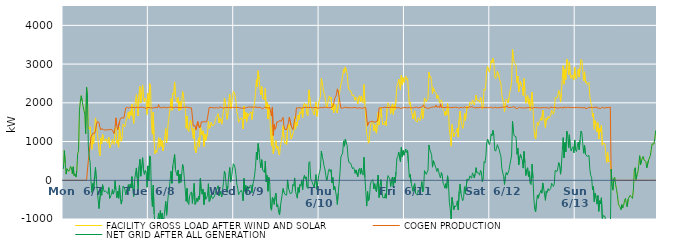
| Category | FACILITY GROSS LOAD AFTER WIND AND SOLAR | COGEN PRODUCTION | NET GRID AFTER ALL GENERATION |
|---|---|---|---|
|  Mon  6/7 | 294 | 0 | 294 |
|  Mon  6/7 | 766 | 0 | 766 |
|  Mon  6/7 | 447 | 0 | 447 |
|  Mon  6/7 | 160 | 0 | 160 |
|  Mon  6/7 | 298 | 0 | 298 |
|  Mon  6/7 | 299 | 0 | 299 |
|  Mon  6/7 | 231 | 0 | 231 |
|  Mon  6/7 | 272 | 0 | 272 |
|  Mon  6/7 | 359 | 0 | 359 |
|  Mon  6/7 | 328 | 0 | 328 |
|  Mon  6/7 | 166 | 0 | 166 |
|  Mon  6/7 | 348 | 0 | 348 |
|  Mon  6/7 | 120 | 0 | 120 |
|  Mon  6/7 | 164 | 0 | 164 |
|  Mon  6/7 | 82 | 0 | 82 |
|  Mon  6/7 | 239 | 0 | 239 |
|  Mon  6/7 | 687 | 0 | 687 |
|  Mon  6/7 | 764 | 0 | 764 |
|  Mon  6/7 | 1805 | 0 | 1805 |
|  Mon  6/7 | 2027 | 0 | 2027 |
|  Mon  6/7 | 2183 | 0 | 2183 |
|  Mon  6/7 | 2055 | 0 | 2055 |
|  Mon  6/7 | 1924 | 0 | 1924 |
|  Mon  6/7 | 1907 | 0 | 1907 |
|  Mon  6/7 | 1708 | 0 | 1708 |
|  Mon  6/7 | 1203 | 0 | 1203 |
|  Mon  6/7 | 2402 | 0 | 2402 |
|  Mon  6/7 | 2151 | 0 | 2151 |
|  Mon  6/7 | 1401 | 518 | 883 |
|  Mon  6/7 | 1317 | 716 | 601 |
|  Mon  6/7 | 1381 | 915 | 466 |
|  Mon  6/7 | 1094 | 1120 | -26 |
|  Mon  6/7 | 798 | 1112 | -314 |
|  Mon  6/7 | 1129 | 1211 | -82 |
|  Mon  6/7 | 947 | 1205 | -258 |
|  Mon  6/7 | 1332 | 1212 | 120 |
|  Mon  6/7 | 1610 | 1278 | 332 |
|  Mon  6/7 | 1437 | 1422 | 15 |
|  Mon  6/7 | 1253 | 1520 | -267 |
|  Mon  6/7 | 1029 | 1522 | -493 |
|  Mon  6/7 | 758 | 1489 | -731 |
|  Mon  6/7 | 634 | 1370 | -736 |
|  Mon  6/7 | 1093 | 1302 | -209 |
|  Mon  6/7 | 947 | 1333 | -386 |
|  Mon  6/7 | 1193 | 1308 | -115 |
|  Mon  6/7 | 1079 | 1307 | -228 |
|  Mon  6/7 | 1008 | 1308 | -300 |
|  Mon  6/7 | 1024 | 1297 | -273 |
|  Mon  6/7 | 1071 | 1319 | -248 |
|  Mon  6/7 | 987 | 1303 | -316 |
|  Mon  6/7 | 957 | 1306 | -349 |
|  Mon  6/7 | 1116 | 1305 | -189 |
|  Mon  6/7 | 834 | 1299 | -465 |
|  Mon  6/7 | 903 | 1315 | -412 |
|  Mon  6/7 | 941 | 1307 | -366 |
|  Mon  6/7 | 1055 | 1296 | -241 |
|  Mon  6/7 | 954 | 1312 | -358 |
|  Mon  6/7 | 923 | 1207 | -284 |
|  Mon  6/7 | 1339 | 1353 | -14 |
|  Mon  6/7 | 1368 | 1612 | -244 |
|  Mon  6/7 | 953 | 1406 | -453 |
|  Mon  6/7 | 1029 | 1306 | -277 |
|  Mon  6/7 | 852 | 1316 | -464 |
|  Mon  6/7 | 1372 | 1504 | -132 |
|  Mon  6/7 | 1122 | 1598 | -476 |
|  Mon  6/7 | 1005 | 1620 | -615 |
|  Mon  6/7 | 1114 | 1611 | -497 |
|  Mon  6/7 | 1454 | 1603 | -149 |
|  Mon  6/7 | 1455 | 1607 | -152 |
|  Mon  6/7 | 1375 | 1600 | -225 |
|  Mon  6/7 | 1499 | 1869 | -370 |
|  Mon  6/7 | 1483 | 1871 | -388 |
|  Mon  6/7 | 1671 | 1882 | -211 |
|  Mon  6/7 | 1759 | 1872 | -113 |
|  Mon  6/7 | 1585 | 1861 | -276 |
|  Mon  6/7 | 1781 | 1888 | -107 |
|  Mon  6/7 | 1676 | 1874 | -198 |
|  Mon  6/7 | 1971 | 1877 | 94 |
|  Mon  6/7 | 1664 | 1863 | -199 |
|  Mon  6/7 | 1465 | 1882 | -417 |
|  Mon  6/7 | 1882 | 1879 | 3 |
|  Mon  6/7 | 1863 | 1873 | -10 |
|  Mon  6/7 | 2212 | 1894 | 318 |
|  Mon  6/7 | 1939 | 1890 | 49 |
|  Mon  6/7 | 1662 | 1883 | -221 |
|  Mon  6/7 | 2215 | 1869 | 346 |
|  Mon  6/7 | 2424 | 1880 | 544 |
|  Mon  6/7 | 1997 | 1893 | 104 |
|  Mon  6/7 | 2252 | 1876 | 376 |
|  Mon  6/7 | 2462 | 1880 | 582 |
|  Mon  6/7 | 2119 | 1872 | 247 |
|  Mon  6/7 | 2029 | 1876 | 153 |
|  Mon  6/7 | 2123 | 1871 | 252 |
|  Mon  6/7 | 2066 | 1851 | 215 |
|  Mon  6/7 | 1699 | 1879 | -180 |
|  Mon  6/7 | 2253 | 1882 | 371 |
|  Tue  6/8 | 1859 | 1876 | -17 |
|  Tue  6/8 | 2493 | 1865 | 628 |
|  Tue  6/8 | 2418 | 1873 | 545 |
|  Tue  6/8 | 1460 | 1877 | -417 |
|  Tue  6/8 | 1191 | 1867 | -676 |
|  Tue  6/8 | 1759 | 1883 | -124 |
|  Tue  6/8 | 1002 | 1876 | -874 |
|  Tue  6/8 | 682 | 1872 | -1190 |
|  Tue  6/8 | 777 | 1886 | -1109 |
|  Tue  6/8 | 716 | 1873 | -1157 |
|  Tue  6/8 | 853 | 1871 | -1018 |
|  Tue  6/8 | 1102 | 1954 | -852 |
|  Tue  6/8 | 831 | 1882 | -1051 |
|  Tue  6/8 | 1083 | 1866 | -783 |
|  Tue  6/8 | 876 | 1870 | -994 |
|  Tue  6/8 | 1026 | 1878 | -852 |
|  Tue  6/8 | 756 | 1876 | -1120 |
|  Tue  6/8 | 900 | 1873 | -973 |
|  Tue  6/8 | 1124 | 1890 | -766 |
|  Tue  6/8 | 1333 | 1879 | -546 |
|  Tue  6/8 | 965 | 1868 | -903 |
|  Tue  6/8 | 1260 | 1873 | -613 |
|  Tue  6/8 | 1519 | 1881 | -362 |
|  Tue  6/8 | 1664 | 1881 | -217 |
|  Tue  6/8 | 1685 | 1891 | -206 |
|  Tue  6/8 | 2109 | 1872 | 237 |
|  Tue  6/8 | 1807 | 1885 | -78 |
|  Tue  6/8 | 2255 | 1880 | 375 |
|  Tue  6/8 | 2225 | 1871 | 354 |
|  Tue  6/8 | 2538 | 1871 | 667 |
|  Tue  6/8 | 2161 | 1889 | 272 |
|  Tue  6/8 | 2056 | 1870 | 186 |
|  Tue  6/8 | 1999 | 1882 | 117 |
|  Tue  6/8 | 2142 | 1876 | 266 |
|  Tue  6/8 | 1797 | 1873 | -76 |
|  Tue  6/8 | 2039 | 1882 | 157 |
|  Tue  6/8 | 1823 | 1875 | -52 |
|  Tue  6/8 | 2033 | 1871 | 162 |
|  Tue  6/8 | 2289 | 1881 | 408 |
|  Tue  6/8 | 2180 | 1879 | 301 |
|  Tue  6/8 | 1920 | 1882 | 38 |
|  Tue  6/8 | 1890 | 1873 | 17 |
|  Tue  6/8 | 1344 | 1888 | -544 |
|  Tue  6/8 | 1662 | 1871 | -209 |
|  Tue  6/8 | 1304 | 1880 | -576 |
|  Tue  6/8 | 1254 | 1880 | -626 |
|  Tue  6/8 | 1483 | 1871 | -388 |
|  Tue  6/8 | 1549 | 1887 | -338 |
|  Tue  6/8 | 1572 | 1871 | -299 |
|  Tue  6/8 | 1268 | 1866 | -598 |
|  Tue  6/8 | 1082 | 1402 | -320 |
|  Tue  6/8 | 1336 | 1416 | -80 |
|  Tue  6/8 | 786 | 1410 | -624 |
|  Tue  6/8 | 710 | 1302 | -592 |
|  Tue  6/8 | 854 | 1313 | -459 |
|  Tue  6/8 | 969 | 1516 | -547 |
|  Tue  6/8 | 1095 | 1508 | -413 |
|  Tue  6/8 | 858 | 1350 | -492 |
|  Tue  6/8 | 1430 | 1378 | 52 |
|  Tue  6/8 | 1222 | 1506 | -284 |
|  Tue  6/8 | 1164 | 1522 | -358 |
|  Tue  6/8 | 1278 | 1509 | -231 |
|  Tue  6/8 | 876 | 1504 | -628 |
|  Tue  6/8 | 1197 | 1510 | -313 |
|  Tue  6/8 | 1029 | 1520 | -491 |
|  Tue  6/8 | 1048 | 1508 | -460 |
|  Tue  6/8 | 1219 | 1608 | -389 |
|  Tue  6/8 | 1529 | 1617 | -88 |
|  Tue  6/8 | 1333 | 1884 | -551 |
|  Tue  6/8 | 1362 | 1878 | -516 |
|  Tue  6/8 | 1500 | 1874 | -374 |
|  Tue  6/8 | 1428 | 1869 | -441 |
|  Tue  6/8 | 1400 | 1876 | -476 |
|  Tue  6/8 | 1416 | 1882 | -466 |
|  Tue  6/8 | 1461 | 1866 | -405 |
|  Tue  6/8 | 1586 | 1887 | -301 |
|  Tue  6/8 | 1586 | 1881 | -295 |
|  Tue  6/8 | 1665 | 1870 | -205 |
|  Tue  6/8 | 1721 | 1863 | -142 |
|  Tue  6/8 | 1481 | 1880 | -399 |
|  Tue  6/8 | 1611 | 1891 | -280 |
|  Tue  6/8 | 1529 | 1879 | -350 |
|  Tue  6/8 | 1447 | 1875 | -428 |
|  Tue  6/8 | 1638 | 1880 | -242 |
|  Tue  6/8 | 1814 | 1865 | -51 |
|  Tue  6/8 | 2114 | 1875 | 239 |
|  Tue  6/8 | 2027 | 1879 | 148 |
|  Tue  6/8 | 1749 | 1875 | -126 |
|  Tue  6/8 | 1574 | 1886 | -312 |
|  Tue  6/8 | 1728 | 1874 | -146 |
|  Tue  6/8 | 2031 | 1878 | 153 |
|  Tue  6/8 | 2225 | 1896 | 329 |
|  Tue  6/8 | 1841 | 1875 | -34 |
|  Tue  6/8 | 1931 | 1879 | 52 |
|  Tue  6/8 | 2133 | 1887 | 246 |
|  Tue  6/8 | 2301 | 1874 | 427 |
|  Wed  6/9 | 2272 | 1876 | 396 |
|  Wed  6/9 | 2194 | 1877 | 317 |
|  Wed  6/9 | 2032 | 1882 | 150 |
|  Wed  6/9 | 1775 | 1875 | -100 |
|  Wed  6/9 | 1676 | 1882 | -206 |
|  Wed  6/9 | 1496 | 1870 | -374 |
|  Wed  6/9 | 1550 | 1869 | -319 |
|  Wed  6/9 | 1553 | 1870 | -317 |
|  Wed  6/9 | 1612 | 1867 | -255 |
|  Wed  6/9 | 1563 | 1880 | -317 |
|  Wed  6/9 | 1330 | 1859 | -529 |
|  Wed  6/9 | 1915 | 1866 | 49 |
|  Wed  6/9 | 1583 | 1866 | -283 |
|  Wed  6/9 | 1761 | 1888 | -127 |
|  Wed  6/9 | 1501 | 1875 | -374 |
|  Wed  6/9 | 1724 | 1875 | -151 |
|  Wed  6/9 | 1656 | 1892 | -236 |
|  Wed  6/9 | 1714 | 1870 | -156 |
|  Wed  6/9 | 1728 | 1892 | -164 |
|  Wed  6/9 | 1768 | 1892 | -124 |
|  Wed  6/9 | 1567 | 1886 | -319 |
|  Wed  6/9 | 1773 | 1873 | -100 |
|  Wed  6/9 | 1876 | 1884 | -8 |
|  Wed  6/9 | 2027 | 1888 | 139 |
|  Wed  6/9 | 2250 | 1891 | 359 |
|  Wed  6/9 | 2601 | 1873 | 728 |
|  Wed  6/9 | 2413 | 1880 | 533 |
|  Wed  6/9 | 2828 | 1879 | 949 |
|  Wed  6/9 | 2616 | 1883 | 733 |
|  Wed  6/9 | 2383 | 1886 | 497 |
|  Wed  6/9 | 2201 | 1875 | 326 |
|  Wed  6/9 | 2421 | 1890 | 531 |
|  Wed  6/9 | 2112 | 1845 | 267 |
|  Wed  6/9 | 2134 | 1869 | 265 |
|  Wed  6/9 | 2085 | 1884 | 201 |
|  Wed  6/9 | 2370 | 1874 | 496 |
|  Wed  6/9 | 1840 | 1881 | -41 |
|  Wed  6/9 | 2015 | 1890 | 125 |
|  Wed  6/9 | 1581 | 1864 | -283 |
|  Wed  6/9 | 1948 | 1875 | 73 |
|  Wed  6/9 | 1796 | 1877 | -81 |
|  Wed  6/9 | 1158 | 1875 | -717 |
|  Wed  6/9 | 883 | 1657 | -774 |
|  Wed  6/9 | 1441 | 1885 | -444 |
|  Wed  6/9 | 685 | 1159 | -474 |
|  Wed  6/9 | 814 | 1437 | -623 |
|  Wed  6/9 | 895 | 1318 | -423 |
|  Wed  6/9 | 1025 | 1358 | -333 |
|  Wed  6/9 | 823 | 1506 | -683 |
|  Wed  6/9 | 882 | 1513 | -631 |
|  Wed  6/9 | 691 | 1508 | -817 |
|  Wed  6/9 | 648 | 1544 | -896 |
|  Wed  6/9 | 879 | 1547 | -668 |
|  Wed  6/9 | 863 | 1525 | -662 |
|  Wed  6/9 | 1138 | 1500 | -362 |
|  Wed  6/9 | 1412 | 1625 | -213 |
|  Wed  6/9 | 1094 | 1405 | -311 |
|  Wed  6/9 | 947 | 1309 | -362 |
|  Wed  6/9 | 984 | 1326 | -342 |
|  Wed  6/9 | 924 | 1310 | -386 |
|  Wed  6/9 | 1305 | 1295 | 10 |
|  Wed  6/9 | 1287 | 1487 | -200 |
|  Wed  6/9 | 1450 | 1627 | -177 |
|  Wed  6/9 | 1263 | 1608 | -345 |
|  Wed  6/9 | 1064 | 1413 | -349 |
|  Wed  6/9 | 1089 | 1412 | -323 |
|  Wed  6/9 | 1204 | 1310 | -106 |
|  Wed  6/9 | 1272 | 1423 | -151 |
|  Wed  6/9 | 1641 | 1580 | 61 |
|  Wed  6/9 | 1321 | 1611 | -290 |
|  Wed  6/9 | 1499 | 1871 | -372 |
|  Wed  6/9 | 1412 | 1873 | -461 |
|  Wed  6/9 | 1683 | 1868 | -185 |
|  Wed  6/9 | 1568 | 1881 | -313 |
|  Wed  6/9 | 1766 | 1875 | -109 |
|  Wed  6/9 | 1727 | 1876 | -149 |
|  Wed  6/9 | 1869 | 1859 | 10 |
|  Wed  6/9 | 1619 | 1863 | -244 |
|  Wed  6/9 | 1936 | 1884 | 52 |
|  Wed  6/9 | 1991 | 1862 | 129 |
|  Wed  6/9 | 1911 | 1879 | 32 |
|  Wed  6/9 | 1963 | 1875 | 88 |
|  Wed  6/9 | 1706 | 1882 | -176 |
|  Wed  6/9 | 1666 | 1880 | -214 |
|  Wed  6/9 | 2334 | 1878 | 456 |
|  Wed  6/9 | 2336 | 1854 | 482 |
|  Wed  6/9 | 1923 | 1886 | 37 |
|  Wed  6/9 | 1874 | 1877 | -3 |
|  Wed  6/9 | 1802 | 1872 | -70 |
|  Wed  6/9 | 1800 | 1878 | -78 |
|  Wed  6/9 | 1689 | 1876 | -187 |
|  Wed  6/9 | 1869 | 1889 | -20 |
|  Wed  6/9 | 2025 | 1880 | 145 |
|  Wed  6/9 | 1649 | 1884 | -235 |
|  Wed  6/9 | 1790 | 1861 | -71 |
|  Wed  6/9 | 2000 | 1879 | 121 |
|  Thu  6/10 | 2080 | 1872 | 208 |
|  Thu  6/10 | 2164 | 1860 | 304 |
|  Thu  6/10 | 2632 | 1881 | 751 |
|  Thu  6/10 | 2490 | 1873 | 617 |
|  Thu  6/10 | 2397 | 1872 | 525 |
|  Thu  6/10 | 2245 | 1869 | 376 |
|  Thu  6/10 | 2179 | 1887 | 292 |
|  Thu  6/10 | 2012 | 1883 | 129 |
|  Thu  6/10 | 1877 | 1882 | -5 |
|  Thu  6/10 | 1963 | 1878 | 85 |
|  Thu  6/10 | 2106 | 1874 | 232 |
|  Thu  6/10 | 2181 | 1887 | 294 |
|  Thu  6/10 | 2097 | 1875 | 222 |
|  Thu  6/10 | 2150 | 1878 | 272 |
|  Thu  6/10 | 1819 | 1884 | -65 |
|  Thu  6/10 | 1986 | 1916 | 70 |
|  Thu  6/10 | 1747 | 1986 | -239 |
|  Thu  6/10 | 1961 | 2119 | -158 |
|  Thu  6/10 | 1869 | 2150 | -281 |
|  Thu  6/10 | 1792 | 2205 | -413 |
|  Thu  6/10 | 1736 | 2360 | -624 |
|  Thu  6/10 | 1957 | 2288 | -331 |
|  Thu  6/10 | 2189 | 2272 | -83 |
|  Thu  6/10 | 2206 | 2003 | 203 |
|  Thu  6/10 | 2472 | 1869 | 603 |
|  Thu  6/10 | 2542 | 1887 | 655 |
|  Thu  6/10 | 2565 | 1861 | 704 |
|  Thu  6/10 | 2868 | 1852 | 1016 |
|  Thu  6/10 | 2769 | 1889 | 880 |
|  Thu  6/10 | 2927 | 1869 | 1058 |
|  Thu  6/10 | 2846 | 1873 | 973 |
|  Thu  6/10 | 2770 | 1872 | 898 |
|  Thu  6/10 | 2481 | 1876 | 605 |
|  Thu  6/10 | 2337 | 1876 | 461 |
|  Thu  6/10 | 2324 | 1871 | 453 |
|  Thu  6/10 | 2308 | 1869 | 439 |
|  Thu  6/10 | 2326 | 1874 | 452 |
|  Thu  6/10 | 2176 | 1877 | 299 |
|  Thu  6/10 | 2205 | 1874 | 331 |
|  Thu  6/10 | 2161 | 1874 | 287 |
|  Thu  6/10 | 2062 | 1883 | 179 |
|  Thu  6/10 | 2141 | 1874 | 267 |
|  Thu  6/10 | 2115 | 1862 | 253 |
|  Thu  6/10 | 1967 | 1872 | 95 |
|  Thu  6/10 | 2141 | 1872 | 269 |
|  Thu  6/10 | 2184 | 1877 | 307 |
|  Thu  6/10 | 2028 | 1871 | 157 |
|  Thu  6/10 | 2177 | 1867 | 310 |
|  Thu  6/10 | 2032 | 1857 | 175 |
|  Thu  6/10 | 2003 | 1869 | 134 |
|  Thu  6/10 | 2472 | 1876 | 596 |
|  Thu  6/10 | 1963 | 1888 | 75 |
|  Thu  6/10 | 1591 | 1877 | -286 |
|  Thu  6/10 | 1204 | 1871 | -667 |
|  Thu  6/10 | 1118 | 1410 | -292 |
|  Thu  6/10 | 958 | 1489 | -531 |
|  Thu  6/10 | 1026 | 1514 | -488 |
|  Thu  6/10 | 1368 | 1511 | -143 |
|  Thu  6/10 | 1491 | 1526 | -35 |
|  Thu  6/10 | 1502 | 1527 | -25 |
|  Thu  6/10 | 1527 | 1509 | 18 |
|  Thu  6/10 | 1280 | 1502 | -222 |
|  Thu  6/10 | 1437 | 1524 | -87 |
|  Thu  6/10 | 1271 | 1511 | -240 |
|  Thu  6/10 | 1211 | 1508 | -297 |
|  Thu  6/10 | 1228 | 1529 | -301 |
|  Thu  6/10 | 1755 | 1619 | 136 |
|  Thu  6/10 | 1426 | 1871 | -445 |
|  Thu  6/10 | 1728 | 1887 | -159 |
|  Thu  6/10 | 1882 | 1866 | 16 |
|  Thu  6/10 | 1619 | 1864 | -245 |
|  Thu  6/10 | 1430 | 1873 | -443 |
|  Thu  6/10 | 1461 | 1895 | -434 |
|  Thu  6/10 | 1429 | 1887 | -458 |
|  Thu  6/10 | 1527 | 1873 | -346 |
|  Thu  6/10 | 1416 | 1879 | -463 |
|  Thu  6/10 | 1850 | 1867 | -17 |
|  Thu  6/10 | 2001 | 1880 | 121 |
|  Thu  6/10 | 1952 | 1873 | 79 |
|  Thu  6/10 | 1910 | 1875 | 35 |
|  Thu  6/10 | 1720 | 1881 | -161 |
|  Thu  6/10 | 1914 | 1890 | 24 |
|  Thu  6/10 | 1976 | 1893 | 83 |
|  Thu  6/10 | 1699 | 1876 | -177 |
|  Thu  6/10 | 1951 | 1872 | 79 |
|  Thu  6/10 | 1828 | 1889 | -61 |
|  Thu  6/10 | 2079 | 1866 | 213 |
|  Thu  6/10 | 2443 | 1869 | 574 |
|  Thu  6/10 | 2486 | 1874 | 612 |
|  Thu  6/10 | 2611 | 1880 | 731 |
|  Thu  6/10 | 2620 | 1870 | 750 |
|  Thu  6/10 | 2340 | 1857 | 483 |
|  Thu  6/10 | 2715 | 1869 | 846 |
|  Thu  6/10 | 2472 | 1864 | 608 |
|  Thu  6/10 | 2650 | 1882 | 768 |
|  Thu  6/10 | 2528 | 1880 | 648 |
|  Fri  6/11 | 2514 | 1873 | 641 |
|  Fri  6/11 | 2684 | 1877 | 807 |
|  Fri  6/11 | 2607 | 1891 | 716 |
|  Fri  6/11 | 2638 | 1872 | 766 |
|  Fri  6/11 | 2302 | 1867 | 435 |
|  Fri  6/11 | 1955 | 1878 | 77 |
|  Fri  6/11 | 2021 | 1873 | 148 |
|  Fri  6/11 | 1814 | 1871 | -57 |
|  Fri  6/11 | 1713 | 1884 | -171 |
|  Fri  6/11 | 1586 | 1869 | -283 |
|  Fri  6/11 | 1721 | 1875 | -154 |
|  Fri  6/11 | 1795 | 1880 | -85 |
|  Fri  6/11 | 1539 | 1872 | -333 |
|  Fri  6/11 | 1564 | 1890 | -326 |
|  Fri  6/11 | 1504 | 1889 | -385 |
|  Fri  6/11 | 1615 | 1868 | -253 |
|  Fri  6/11 | 1582 | 1887 | -305 |
|  Fri  6/11 | 1536 | 1882 | -346 |
|  Fri  6/11 | 1673 | 1880 | -207 |
|  Fri  6/11 | 1854 | 1887 | -33 |
|  Fri  6/11 | 1592 | 1891 | -299 |
|  Fri  6/11 | 1705 | 1947 | -242 |
|  Fri  6/11 | 2126 | 1880 | 246 |
|  Fri  6/11 | 2067 | 1876 | 191 |
|  Fri  6/11 | 2027 | 1873 | 154 |
|  Fri  6/11 | 2030 | 1876 | 154 |
|  Fri  6/11 | 2119 | 1858 | 261 |
|  Fri  6/11 | 2789 | 1878 | 911 |
|  Fri  6/11 | 2655 | 1866 | 789 |
|  Fri  6/11 | 2681 | 1880 | 801 |
|  Fri  6/11 | 2549 | 1887 | 662 |
|  Fri  6/11 | 2237 | 1898 | 339 |
|  Fri  6/11 | 2392 | 1888 | 504 |
|  Fri  6/11 | 2308 | 1866 | 442 |
|  Fri  6/11 | 2317 | 1895 | 422 |
|  Fri  6/11 | 2256 | 1943 | 313 |
|  Fri  6/11 | 2109 | 1883 | 226 |
|  Fri  6/11 | 2192 | 1882 | 310 |
|  Fri  6/11 | 2132 | 1908 | 224 |
|  Fri  6/11 | 1991 | 1872 | 119 |
|  Fri  6/11 | 2035 | 1974 | 61 |
|  Fri  6/11 | 2077 | 1879 | 198 |
|  Fri  6/11 | 1997 | 1877 | 120 |
|  Fri  6/11 | 1808 | 1883 | -75 |
|  Fri  6/11 | 1782 | 1903 | -121 |
|  Fri  6/11 | 1671 | 1876 | -205 |
|  Fri  6/11 | 1787 | 1875 | -88 |
|  Fri  6/11 | 1683 | 1889 | -206 |
|  Fri  6/11 | 1986 | 1870 | 116 |
|  Fri  6/11 | 1803 | 1884 | -81 |
|  Fri  6/11 | 1306 | 1873 | -567 |
|  Fri  6/11 | 1128 | 1873 | -745 |
|  Fri  6/11 | 881 | 1892 | -1011 |
|  Fri  6/11 | 1439 | 1882 | -443 |
|  Fri  6/11 | 1275 | 1881 | -606 |
|  Fri  6/11 | 1118 | 1878 | -760 |
|  Fri  6/11 | 1208 | 1868 | -660 |
|  Fri  6/11 | 1200 | 1886 | -686 |
|  Fri  6/11 | 1245 | 1875 | -630 |
|  Fri  6/11 | 1350 | 1881 | -531 |
|  Fri  6/11 | 1114 | 1880 | -766 |
|  Fri  6/11 | 1571 | 1859 | -288 |
|  Fri  6/11 | 1783 | 1883 | -100 |
|  Fri  6/11 | 1551 | 1885 | -334 |
|  Fri  6/11 | 1434 | 1881 | -447 |
|  Fri  6/11 | 1343 | 1871 | -528 |
|  Fri  6/11 | 1435 | 1879 | -444 |
|  Fri  6/11 | 1724 | 1891 | -167 |
|  Fri  6/11 | 1539 | 1881 | -342 |
|  Fri  6/11 | 1547 | 1876 | -329 |
|  Fri  6/11 | 1917 | 1885 | 32 |
|  Fri  6/11 | 1915 | 1874 | 41 |
|  Fri  6/11 | 1859 | 1850 | 9 |
|  Fri  6/11 | 2017 | 1903 | 114 |
|  Fri  6/11 | 1987 | 1875 | 112 |
|  Fri  6/11 | 1958 | 1906 | 52 |
|  Fri  6/11 | 2074 | 1882 | 192 |
|  Fri  6/11 | 2023 | 1882 | 141 |
|  Fri  6/11 | 1945 | 1887 | 58 |
|  Fri  6/11 | 2033 | 1867 | 166 |
|  Fri  6/11 | 2201 | 1875 | 326 |
|  Fri  6/11 | 2072 | 1878 | 194 |
|  Fri  6/11 | 2077 | 1890 | 187 |
|  Fri  6/11 | 2057 | 1872 | 185 |
|  Fri  6/11 | 2011 | 1880 | 131 |
|  Fri  6/11 | 2146 | 1890 | 256 |
|  Fri  6/11 | 2076 | 1866 | 210 |
|  Fri  6/11 | 1836 | 1874 | -38 |
|  Fri  6/11 | 1918 | 1861 | 57 |
|  Fri  6/11 | 2358 | 1877 | 481 |
|  Fri  6/11 | 2320 | 1876 | 444 |
|  Fri  6/11 | 2485 | 1877 | 608 |
|  Fri  6/11 | 2854 | 1884 | 970 |
|  Fri  6/11 | 2940 | 1877 | 1063 |
|  Fri  6/11 | 2842 | 1872 | 970 |
|  Fri  6/11 | 2791 | 1872 | 919 |
|  Sat  6/12 | 2888 | 1879 | 1009 |
|  Sat  6/12 | 3090 | 1891 | 1199 |
|  Sat  6/12 | 3033 | 1886 | 1147 |
|  Sat  6/12 | 3150 | 1860 | 1290 |
|  Sat  6/12 | 3048 | 1883 | 1165 |
|  Sat  6/12 | 2668 | 1890 | 778 |
|  Sat  6/12 | 2626 | 1875 | 751 |
|  Sat  6/12 | 2698 | 1869 | 829 |
|  Sat  6/12 | 2810 | 1891 | 919 |
|  Sat  6/12 | 2788 | 1876 | 912 |
|  Sat  6/12 | 2666 | 1872 | 794 |
|  Sat  6/12 | 2567 | 1874 | 693 |
|  Sat  6/12 | 2481 | 1872 | 609 |
|  Sat  6/12 | 2196 | 1885 | 311 |
|  Sat  6/12 | 2213 | 1890 | 323 |
|  Sat  6/12 | 1978 | 1887 | 91 |
|  Sat  6/12 | 1771 | 1879 | -108 |
|  Sat  6/12 | 1999 | 1887 | 112 |
|  Sat  6/12 | 2096 | 1894 | 202 |
|  Sat  6/12 | 2059 | 1926 | 133 |
|  Sat  6/12 | 1996 | 1876 | 120 |
|  Sat  6/12 | 2133 | 1877 | 256 |
|  Sat  6/12 | 2281 | 1880 | 401 |
|  Sat  6/12 | 2392 | 1875 | 517 |
|  Sat  6/12 | 2535 | 1881 | 654 |
|  Sat  6/12 | 3389 | 1863 | 1526 |
|  Sat  6/12 | 3137 | 1895 | 1242 |
|  Sat  6/12 | 3041 | 1894 | 1147 |
|  Sat  6/12 | 3045 | 1890 | 1155 |
|  Sat  6/12 | 2969 | 1847 | 1122 |
|  Sat  6/12 | 2523 | 1851 | 672 |
|  Sat  6/12 | 2691 | 1863 | 828 |
|  Sat  6/12 | 2284 | 1887 | 397 |
|  Sat  6/12 | 2479 | 1887 | 592 |
|  Sat  6/12 | 2552 | 1884 | 668 |
|  Sat  6/12 | 2436 | 1866 | 570 |
|  Sat  6/12 | 2395 | 1871 | 524 |
|  Sat  6/12 | 2184 | 1870 | 314 |
|  Sat  6/12 | 2626 | 1882 | 744 |
|  Sat  6/12 | 2310 | 1869 | 441 |
|  Sat  6/12 | 1989 | 1866 | 123 |
|  Sat  6/12 | 2146 | 1874 | 272 |
|  Sat  6/12 | 2197 | 1874 | 323 |
|  Sat  6/12 | 1966 | 1876 | 90 |
|  Sat  6/12 | 2101 | 1874 | 227 |
|  Sat  6/12 | 1803 | 1887 | -84 |
|  Sat  6/12 | 1779 | 1892 | -113 |
|  Sat  6/12 | 2271 | 1855 | 416 |
|  Sat  6/12 | 1925 | 1867 | 58 |
|  Sat  6/12 | 1415 | 1879 | -464 |
|  Sat  6/12 | 1123 | 1873 | -750 |
|  Sat  6/12 | 1063 | 1878 | -815 |
|  Sat  6/12 | 1312 | 1880 | -568 |
|  Sat  6/12 | 1492 | 1872 | -380 |
|  Sat  6/12 | 1419 | 1882 | -463 |
|  Sat  6/12 | 1516 | 1871 | -355 |
|  Sat  6/12 | 1545 | 1874 | -329 |
|  Sat  6/12 | 1613 | 1868 | -255 |
|  Sat  6/12 | 1546 | 1880 | -334 |
|  Sat  6/12 | 1808 | 1877 | -69 |
|  Sat  6/12 | 1675 | 1874 | -199 |
|  Sat  6/12 | 1520 | 1873 | -353 |
|  Sat  6/12 | 1355 | 1873 | -518 |
|  Sat  6/12 | 1602 | 1877 | -275 |
|  Sat  6/12 | 1557 | 1877 | -320 |
|  Sat  6/12 | 1649 | 1864 | -215 |
|  Sat  6/12 | 1598 | 1870 | -272 |
|  Sat  6/12 | 1592 | 1865 | -273 |
|  Sat  6/12 | 1683 | 1893 | -210 |
|  Sat  6/12 | 1810 | 1886 | -76 |
|  Sat  6/12 | 1761 | 1874 | -113 |
|  Sat  6/12 | 1708 | 1868 | -160 |
|  Sat  6/12 | 1790 | 1885 | -95 |
|  Sat  6/12 | 2132 | 1878 | 254 |
|  Sat  6/12 | 2114 | 1872 | 242 |
|  Sat  6/12 | 2122 | 1895 | 227 |
|  Sat  6/12 | 2189 | 1866 | 323 |
|  Sat  6/12 | 2317 | 1861 | 456 |
|  Sat  6/12 | 2249 | 1872 | 377 |
|  Sat  6/12 | 2017 | 1861 | 156 |
|  Sat  6/12 | 2265 | 1880 | 385 |
|  Sat  6/12 | 2633 | 1866 | 767 |
|  Sat  6/12 | 2960 | 1859 | 1101 |
|  Sat  6/12 | 2480 | 1899 | 581 |
|  Sat  6/12 | 2870 | 1892 | 978 |
|  Sat  6/12 | 2607 | 1870 | 737 |
|  Sat  6/12 | 3128 | 1859 | 1269 |
|  Sat  6/12 | 3075 | 1889 | 1186 |
|  Sat  6/12 | 2729 | 1886 | 843 |
|  Sat  6/12 | 3055 | 1880 | 1175 |
|  Sat  6/12 | 2701 | 1874 | 827 |
|  Sat  6/12 | 2631 | 1877 | 754 |
|  Sat  6/12 | 2720 | 1885 | 835 |
|  Sat  6/12 | 2738 | 1872 | 866 |
|  Sat  6/12 | 2586 | 1877 | 709 |
|  Sat  6/12 | 2919 | 1878 | 1041 |
|  Sun  6/13 | 2655 | 1874 | 781 |
|  Sun  6/13 | 2623 | 1881 | 742 |
|  Sun  6/13 | 2774 | 1869 | 905 |
|  Sun  6/13 | 2868 | 1881 | 987 |
|  Sun  6/13 | 2665 | 1876 | 789 |
|  Sun  6/13 | 2916 | 1870 | 1046 |
|  Sun  6/13 | 3121 | 1850 | 1271 |
|  Sun  6/13 | 3092 | 1877 | 1215 |
|  Sun  6/13 | 2831 | 1879 | 952 |
|  Sun  6/13 | 2567 | 1867 | 700 |
|  Sun  6/13 | 2801 | 1893 | 908 |
|  Sun  6/13 | 2526 | 1849 | 677 |
|  Sun  6/13 | 2553 | 1866 | 687 |
|  Sun  6/13 | 2473 | 1859 | 614 |
|  Sun  6/13 | 2463 | 1857 | 606 |
|  Sun  6/13 | 2523 | 1881 | 642 |
|  Sun  6/13 | 2157 | 1880 | 277 |
|  Sun  6/13 | 2007 | 1882 | 125 |
|  Sun  6/13 | 1934 | 1866 | 68 |
|  Sun  6/13 | 1633 | 1875 | -242 |
|  Sun  6/13 | 1728 | 1890 | -162 |
|  Sun  6/13 | 1319 | 1879 | -560 |
|  Sun  6/13 | 1539 | 1872 | -333 |
|  Sun  6/13 | 1450 | 1897 | -447 |
|  Sun  6/13 | 1251 | 1866 | -615 |
|  Sun  6/13 | 1487 | 1881 | -394 |
|  Sun  6/13 | 1064 | 1866 | -802 |
|  Sun  6/13 | 1348 | 1876 | -528 |
|  Sun  6/13 | 1245 | 1852 | -607 |
|  Sun  6/13 | 1425 | 1877 | -452 |
|  Sun  6/13 | 908 | 1893 | -985 |
|  Sun  6/13 | 953 | 1867 | -914 |
|  Sun  6/13 | 967 | 1879 | -912 |
|  Sun  6/13 | 938 | 1870 | -932 |
|  Sun  6/13 | 653 | 1877 | -1224 |
|  Sun  6/13 | 461 | 1875 | -1414 |
|  Sun  6/13 | 719 | 1882 | -1163 |
|  Sun  6/13 | 479 | 1878 | -1399 |
|  Sun  6/13 | 488 | 1890 | -1402 |
|  Sun  6/13 | 501 | 1890 | -1389 |
|  Sun  6/13 | 284 | 0 | 284 |
|  Sun  6/13 | -152 | 0 | -152 |
|  Sun  6/13 | -255 | 0 | -255 |
|  Sun  6/13 | 41 | 0 | 41 |
|  Sun  6/13 | 78 | 0 | 78 |
|  Sun  6/13 | -117 | 0 | -117 |
|  Sun  6/13 | -237 | 0 | -237 |
|  Sun  6/13 | -389 | 0 | -389 |
|  Sun  6/13 | -599 | 0 | -599 |
|  Sun  6/13 | -657 | 0 | -657 |
|  Sun  6/13 | -689 | 0 | -689 |
|  Sun  6/13 | -759 | 0 | -759 |
|  Sun  6/13 | -630 | 0 | -630 |
|  Sun  6/13 | -717 | 0 | -717 |
|  Sun  6/13 | -646 | 0 | -646 |
|  Sun  6/13 | -529 | 0 | -529 |
|  Sun  6/13 | -468 | 0 | -468 |
|  Sun  6/13 | -598 | 0 | -598 |
|  Sun  6/13 | -685 | 0 | -685 |
|  Sun  6/13 | -490 | 0 | -490 |
|  Sun  6/13 | -500 | 0 | -500 |
|  Sun  6/13 | -394 | 0 | -394 |
|  Sun  6/13 | -403 | 0 | -403 |
|  Sun  6/13 | -430 | 0 | -430 |
|  Sun  6/13 | -469 | 0 | -469 |
|  Sun  6/13 | -222 | 0 | -222 |
|  Sun  6/13 | 266 | 0 | 266 |
|  Sun  6/13 | 324 | 0 | 324 |
|  Sun  6/13 | 22 | 0 | 22 |
|  Sun  6/13 | 140 | 0 | 140 |
|  Sun  6/13 | 212 | 0 | 212 |
|  Sun  6/13 | 390 | 0 | 390 |
|  Sun  6/13 | 634 | 0 | 634 |
|  Sun  6/13 | 406 | 0 | 406 |
|  Sun  6/13 | 495 | 0 | 495 |
|  Sun  6/13 | 574 | 0 | 574 |
|  Sun  6/13 | 614 | 0 | 614 |
|  Sun  6/13 | 520 | 0 | 520 |
|  Sun  6/13 | 503 | 0 | 503 |
|  Sun  6/13 | 487 | 0 | 487 |
|  Sun  6/13 | 321 | 0 | 321 |
|  Sun  6/13 | 306 | 0 | 306 |
|  Sun  6/13 | 519 | 0 | 519 |
|  Sun  6/13 | 515 | 0 | 515 |
|  Sun  6/13 | 636 | 0 | 636 |
|  Sun  6/13 | 791 | 0 | 791 |
|  Sun  6/13 | 939 | 0 | 939 |
|  Sun  6/13 | 925 | 0 | 925 |
|  Sun  6/13 | 935 | 0 | 935 |
|  Sun  6/13 | 1068 | 0 | 1068 |
|  Sun  6/13 | 1287 | 0 | 1287 |
|  Sun  6/13 | 1264 | 0 | 1264 |